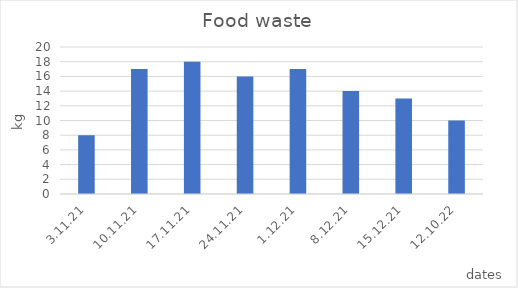
| Category | (kg) |
|---|---|
| 3.11.21 | 8 |
| 10.11.21 | 17 |
| 17.11.21 | 18 |
| 24.11.21 | 16 |
| 1.12.21 | 17 |
| 8.12.21 | 14 |
| 15.12.21 | 13 |
| 12.10.22 | 10 |